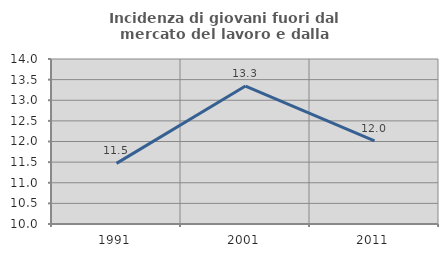
| Category | Incidenza di giovani fuori dal mercato del lavoro e dalla formazione  |
|---|---|
| 1991.0 | 11.47 |
| 2001.0 | 13.344 |
| 2011.0 | 12.015 |